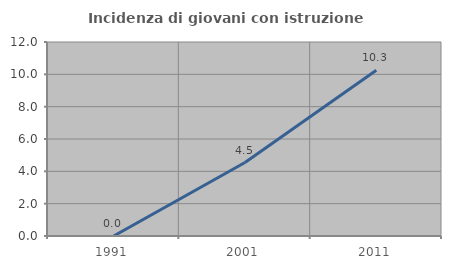
| Category | Incidenza di giovani con istruzione universitaria |
|---|---|
| 1991.0 | 0 |
| 2001.0 | 4.545 |
| 2011.0 | 10.256 |